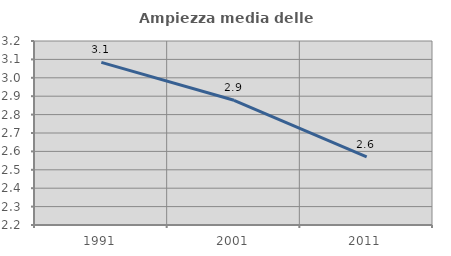
| Category | Ampiezza media delle famiglie |
|---|---|
| 1991.0 | 3.084 |
| 2001.0 | 2.878 |
| 2011.0 | 2.571 |